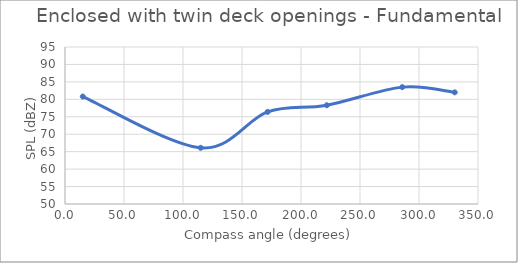
| Category | Series 0 |
|---|---|
| 15.06445125542554 | 80.8 |
| 115.00449447818254 | 66.1 |
| 171.7068171198818 | 76.4 |
| 221.8691292075067 | 78.3 |
| 285.7828166838848 | 83.5 |
| 330.28010595813004 | 82 |